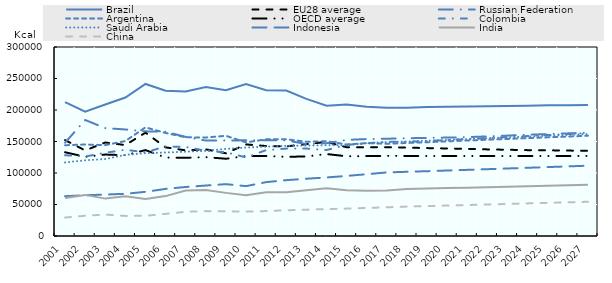
| Category | Brazil | EU28 average | Russian Federation | Argentina | OECD average | Colombia | Saudi Arabia | Indonesia | India | China |
|---|---|---|---|---|---|---|---|---|---|---|
| 2001 | 212538.948 | 152234.333 | 148078.727 | 144073.472 | 132938.681 | 128216.678 | 116807.039 | 63198.918 | 60490.873 | 29296.835 |
| 2002 | 197333.438 | 135815.019 | 184124.674 | 145242.33 | 125702.992 | 126137.48 | 120129.839 | 64675.554 | 65254.604 | 32136.596 |
| 2003 | 208703.539 | 148415.453 | 171277.675 | 144256.068 | 129273.916 | 132114.824 | 122157.806 | 65767.804 | 59351.2 | 34053.552 |
| 2004 | 219771.08 | 144360.409 | 169098.871 | 150788.201 | 128253.399 | 136867.876 | 128783.986 | 67010.891 | 63259.417 | 31875.778 |
| 2005 | 241329.752 | 164031.271 | 166124.857 | 172415.283 | 136351.864 | 132768.176 | 131451.515 | 70106.656 | 58936.895 | 32125.466 |
| 2006 | 230690.09 | 140690.044 | 165522.013 | 163569.817 | 124557.06 | 142137.584 | 132577.936 | 74777.323 | 63313.224 | 35138.964 |
| 2007 | 229290.852 | 135912.838 | 157259.993 | 156658.126 | 124184.058 | 141370.743 | 133788.617 | 77802.301 | 72096.662 | 38398.909 |
| 2008 | 236356.358 | 137540.35 | 151464.339 | 156400.86 | 125143.686 | 135230.012 | 135162.381 | 80117.338 | 72961.534 | 39496.927 |
| 2009 | 231509.786 | 131318.752 | 151643.519 | 158975.85 | 122654.103 | 132845.339 | 138330.941 | 82286.414 | 68452.536 | 39184.639 |
| 2010 | 241269.972 | 145365.028 | 151849.129 | 148608.259 | 126911.511 | 124735.13 | 140402.998 | 79148.365 | 64791.329 | 38769.585 |
| 2011 | 231533.833 | 142765.873 | 151921.503 | 153473.821 | 126962.311 | 136348.066 | 141846.108 | 85524.689 | 69600.053 | 39583.526 |
| 2012 | 230778.687 | 142274.963 | 151782.595 | 153616.896 | 125628.303 | 138764.126 | 143163.827 | 88632.009 | 69484.558 | 40802.201 |
| 2013 | 217563.5 | 145761.645 | 145936.314 | 149560.216 | 126330.493 | 138801.098 | 143584.644 | 90902.744 | 72607.903 | 41773.144 |
| 2014 | 206753.11 | 149363.417 | 147250.261 | 150454.687 | 130120.485 | 136444.682 | 144103.185 | 92908.155 | 75954.725 | 42716.953 |
| 2015 | 208849.34 | 140827.507 | 152499.859 | 145288.464 | 126569.861 | 144597.314 | 144095.954 | 95340.137 | 72581.162 | 43477.744 |
| 2016 | 205005.601 | 140870.116 | 153897.304 | 147395.193 | 126787.301 | 147153.141 | 147482.487 | 98115.391 | 71895.603 | 44504.299 |
| 2017 | 203403.654 | 140976.462 | 154407.864 | 146421.91 | 127177.106 | 149466.228 | 149215.819 | 100931.283 | 72245.703 | 45577.302 |
| 2018 | 203679.302 | 140336.647 | 155149.9 | 147652.149 | 127150.167 | 149315.818 | 149926.51 | 101921.992 | 74533.045 | 46726.8 |
| 2019 | 204607.404 | 139526.399 | 155739.721 | 148874.724 | 126995.221 | 150748.882 | 151210.321 | 102871.253 | 75271.416 | 47523.621 |
| 2020 | 205155.934 | 138929.432 | 156245.487 | 150249.442 | 126982.263 | 152310.734 | 152551.854 | 103951.178 | 76020.327 | 48361.697 |
| 2021 | 205639.982 | 138292.452 | 156934.141 | 151531.473 | 126997.799 | 153848.903 | 153862.743 | 104989.851 | 76784.351 | 49184.387 |
| 2022 | 206052.697 | 137470.045 | 158101.347 | 152842.049 | 126922.035 | 155409.205 | 155186.56 | 106062.855 | 77562.667 | 50019.279 |
| 2023 | 206428.401 | 136884.548 | 159367.402 | 154108.401 | 126913.405 | 156996.872 | 156516.125 | 107165.661 | 78347.846 | 50888.19 |
| 2024 | 206834 | 136290.036 | 160731.513 | 155370.812 | 126878.585 | 158608.721 | 157845.143 | 108284.987 | 79140.49 | 51749.502 |
| 2025 | 207565.363 | 136064.09 | 161760.865 | 156632.213 | 126993.581 | 160226.265 | 159168.12 | 109397.373 | 79933.956 | 52599.119 |
| 2026 | 207705.237 | 135570.515 | 162902.084 | 157871.641 | 127018.654 | 161831.668 | 160478.782 | 110494.59 | 80732.592 | 53476.501 |
| 2027 | 207815.352 | 135248.08 | 163989.41 | 159107.026 | 127119.759 | 163451.757 | 161790.255 | 111604.035 | 81534.177 | 54337.638 |